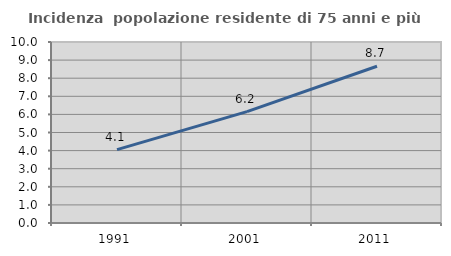
| Category | Incidenza  popolazione residente di 75 anni e più |
|---|---|
| 1991.0 | 4.052 |
| 2001.0 | 6.154 |
| 2011.0 | 8.662 |